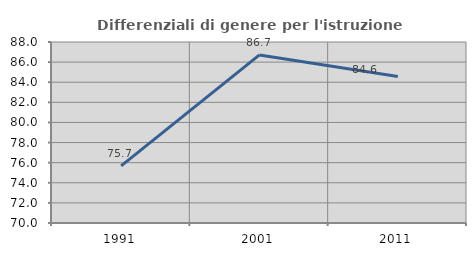
| Category | Differenziali di genere per l'istruzione superiore |
|---|---|
| 1991.0 | 75.676 |
| 2001.0 | 86.714 |
| 2011.0 | 84.56 |